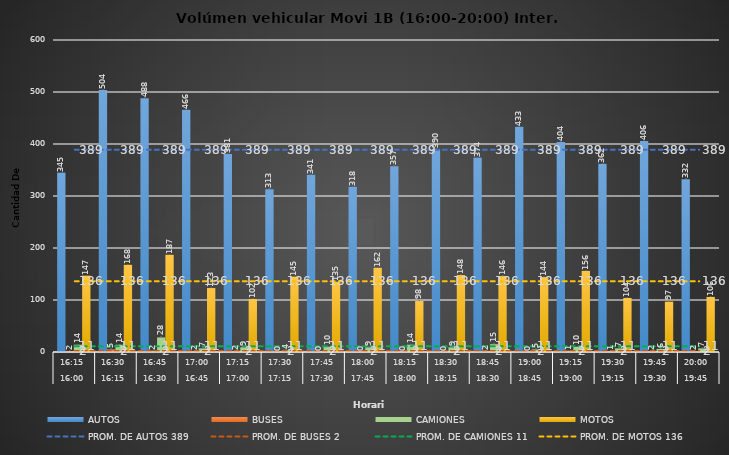
| Category | AUTOS | BUSES | CAMIONES | MOTOS |
|---|---|---|---|---|
| 0 | 345 | 2 | 14 | 147 |
| 1 | 504 | 5 | 14 | 168 |
| 2 | 488 | 2 | 28 | 187 |
| 3 | 466 | 2 | 7 | 123 |
| 4 | 381 | 2 | 9 | 102 |
| 5 | 313 | 0 | 4 | 145 |
| 6 | 341 | 0 | 10 | 135 |
| 7 | 318 | 0 | 9 | 162 |
| 8 | 357 | 0 | 14 | 98 |
| 9 | 390 | 0 | 9 | 148 |
| 10 | 374 | 2 | 15 | 146 |
| 11 | 433 | 0 | 5 | 144 |
| 12 | 404 | 1 | 10 | 156 |
| 13 | 362 | 1 | 7 | 104 |
| 14 | 406 | 2 | 6 | 97 |
| 15 | 332 | 2 | 7 | 106 |